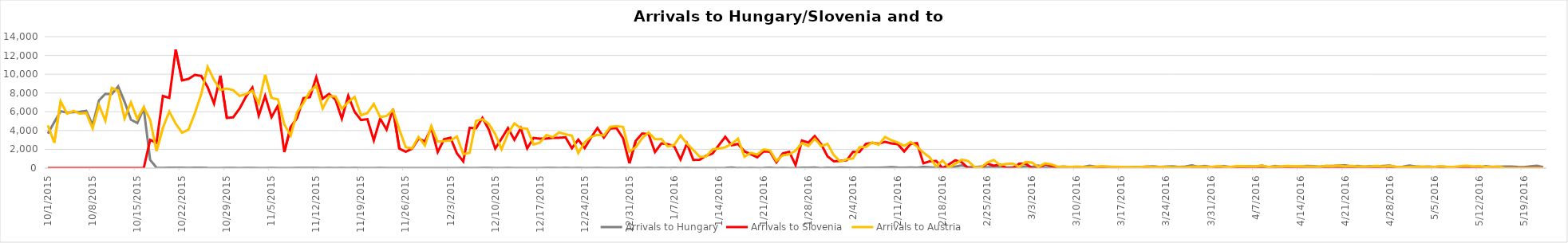
| Category | Arrivals to Hungary | Arrivals to Slovenia | Arrivals to Austria |
|---|---|---|---|
| 10/1/15 | 3667 | 0 | 4550 |
| 10/2/15 | 4897 | 0 | 2700 |
| 10/3/15 | 6056 | 0 | 7100 |
| 10/4/15 | 5925 | 0 | 5800 |
| 10/5/15 | 5952 | 0 | 6100 |
| 10/6/15 | 6000 | 0 | 5800 |
| 10/7/15 | 6103 | 0 | 5861 |
| 10/8/15 | 4583 | 6 | 4229 |
| 10/9/15 | 7215 | 0 | 6700 |
| 10/10/15 | 7907 | 0 | 5050 |
| 10/11/15 | 7897 | 0 | 8540 |
| 10/12/15 | 8702 | 0 | 8240 |
| 10/13/15 | 7081 | 0 | 5280 |
| 10/14/15 | 5157 | 0 | 7000 |
| 10/15/15 | 4808 | 0 | 5235 |
| 10/16/15 | 6353 | 0 | 6500 |
| 10/17/15 | 870 | 3000 | 5155 |
| 10/18/15 | 41 | 2700 | 1822 |
| 10/19/15 | 22 | 7677 | 4300 |
| 10/20/15 | 36 | 7478 | 6017 |
| 10/21/15 | 39 | 12616 | 4737 |
| 10/22/15 | 32 | 9339 | 3767 |
| 10/23/15 | 29 | 9500 | 4092 |
| 10/24/15 | 35 | 9925 | 5841 |
| 10/25/15 | 34 | 9818 | 7882 |
| 10/26/15 | 12 | 8625 | 10784 |
| 10/27/15 | 7 | 6877 | 9390 |
| 10/28/15 | 4 | 9848 | 8336 |
| 10/29/15 | 23 | 5341 | 8473 |
| 10/30/15 | 18 | 5409 | 8302 |
| 10/31/15 | 10 | 6344 | 7691 |
| 11/1/15 | 14 | 7611 | 7887 |
| 11/2/15 | 31 | 8568 | 8243 |
| 11/3/15 | 8 | 5591 | 6900 |
| 11/4/15 | 10 | 7693 | 9930 |
| 11/5/15 | 18 | 5426 | 7478 |
| 11/6/15 | 4 | 6655 | 7315 |
| 11/7/15 | 8 | 1716 | 4648 |
| 11/8/15 | 9 | 4381 | 3465 |
| 11/9/15 | 25 | 5341 | 5962 |
| 11/10/15 | 14 | 7457 | 6933 |
| 11/11/15 | 13 | 7554 | 8169 |
| 11/12/15 | 23 | 9681 | 8777 |
| 11/13/15 | 6 | 7397 | 6351 |
| 11/14/15 | 21 | 7905 | 7659 |
| 11/15/15 | 8 | 7300 | 7632 |
| 11/16/15 | 15 | 5261 | 6319 |
| 11/17/15 | 5 | 7704 | 7026 |
| 11/18/15 | 15 | 5998 | 7577 |
| 11/19/15 | 4 | 5119 | 5635 |
| 11/20/15 | 9 | 5211 | 5865 |
| 11/21/15 | 2 | 2952 | 6836 |
| 11/22/15 | 11 | 5260 | 5446 |
| 11/23/15 | 4 | 4102 | 5546 |
| 11/24/15 | 4 | 6297 | 6204 |
| 11/25/15 | 6 | 2070 | 4122 |
| 11/26/15 | 10 | 1742 | 2211 |
| 11/27/15 | 2 | 2065 | 2120 |
| 11/28/15 | 6 | 3139 | 3320 |
| 11/29/15 | 3 | 2843 | 2407 |
| 11/30/15 | 7 | 4274 | 4482 |
| 12/1/15 | 4 | 1709 | 2821 |
| 12/2/15 | 4 | 3077 | 2874 |
| 12/3/15 | 9 | 3237 | 2935 |
| 12/4/15 | 1 | 1577 | 3366 |
| 12/5/15 | 31 | 715 | 1493 |
| 12/6/15 | 7 | 4288 | 1643 |
| 12/7/15 | 0 | 4240 | 5035 |
| 12/8/15 | 13 | 5351 | 5210 |
| 12/9/15 | 14 | 4103 | 4714 |
| 12/10/15 | 3 | 2078 | 3623 |
| 12/11/15 | 0 | 3149 | 2000 |
| 12/12/15 | 13 | 4271 | 3675 |
| 12/13/15 | 10 | 3016 | 4754 |
| 12/14/15 | 3 | 4250 | 4263 |
| 12/15/15 | 2 | 2098 | 4193 |
| 12/16/15 | 6 | 3214 | 2519 |
| 12/17/15 | 0 | 3135 | 2717 |
| 12/18/15 | 11 | 3150 | 3532 |
| 12/19/15 | 31 | 3222 | 3305 |
| 12/20/15 | 8 | 3233 | 3800 |
| 12/21/15 | 25 | 3278 | 3611 |
| 12/22/15 | 1 | 2118 | 3451 |
| 12/23/15 | 21 | 3030 | 1613 |
| 12/24/15 | 8 | 2131 | 2764 |
| 12/25/15 | 2 | 3257 | 3321 |
| 12/26/15 | 17 | 4274 | 3532 |
| 12/27/15 | 10 | 3253 | 3476 |
| 12/28/15 | 0 | 4228 | 4394 |
| 12/29/15 | 0 | 4239 | 4468 |
| 12/30/15 | 11 | 3195 | 4386 |
| 12/31/15 | 5 | 511 | 1756 |
| 1/1/16 | 0 | 2914 | 2226 |
| 1/2/16 | 0 | 3690 | 3199 |
| 1/3/16 | 17 | 3619 | 3793 |
| 1/4/16 | 3 | 1708 | 3085 |
| 1/5/16 | 18 | 2626 | 3091 |
| 1/6/16 | 5 | 2550 | 2299 |
| 1/7/16 | 31 | 2337 | 2466 |
| 1/8/16 | 7 | 916 | 3472 |
| 1/9/16 | 15 | 2630 | 2619 |
| 1/10/16 | 6 | 880 | 1934 |
| 1/11/16 | 7 | 897 | 1204 |
| 1/12/16 | 2 | 1308 | 1231 |
| 1/13/16 | 5 | 1544 | 1991 |
| 1/14/16 | 4 | 2449 | 2082 |
| 1/15/16 | 14 | 3330 | 2219 |
| 1/16/16 | 65 | 2435 | 2578 |
| 1/17/16 | 11 | 2570 | 3141 |
| 1/18/16 | 9 | 1783 | 1203 |
| 1/19/16 | 29 | 1476 | 1630 |
| 1/20/16 | 10 | 1154 | 1439 |
| 1/21/16 | 13 | 1787 | 1989 |
| 1/22/16 | 47 | 1738 | 1885 |
| 1/23/16 | 10 | 606 | 777 |
| 1/24/16 | 15 | 1564 | 1366 |
| 1/25/16 | 5 | 1746 | 1450 |
| 1/26/16 | 4 | 326 | 1867 |
| 1/27/16 | 36 | 2935 | 2670 |
| 1/28/16 | 51 | 2719 | 2340 |
| 1/29/16 | 69 | 3416 | 3121 |
| 1/30/16 | 6 | 2556 | 2351 |
| 1/31/16 | 39 | 1249 | 2579 |
| 2/1/16 | 31 | 716 | 1367 |
| 2/2/16 | 69 | 765 | 690 |
| 2/3/16 | 46 | 841 | 937 |
| 2/4/16 | 31 | 1733 | 1026 |
| 2/5/16 | 19 | 1713 | 2235 |
| 2/6/16 | 49 | 2580 | 2252 |
| 2/7/16 | 53 | 2694 | 2737 |
| 2/8/16 | 48 | 2582 | 2490 |
| 2/9/16 | 72 | 2805 | 3314 |
| 2/10/16 | 104 | 2637 | 2968 |
| 2/11/16 | 54 | 2547 | 2731 |
| 2/12/16 | 39 | 1774 | 2378 |
| 2/13/16 | 66 | 2576 | 2781 |
| 2/14/16 | 51 | 2660 | 2301 |
| 2/15/16 | 119 | 516 | 1651 |
| 2/16/16 | 93 | 715 | 1143 |
| 2/17/16 | 34 | 769 | 181 |
| 2/18/16 | 73 | 0 | 817 |
| 2/19/16 | 113 | 407 | 50 |
| 2/20/16 | 151 | 828 | 453 |
| 2/21/16 | 288 | 623 | 899 |
| 2/22/16 | 103 | 0 | 744 |
| 2/23/16 | 112 | 0 | 111 |
| 2/24/16 | 166 | 0 | 75 |
| 2/25/16 | 76 | 478 | 583 |
| 2/26/16 | 140 | 254 | 874 |
| 2/27/16 | 111 | 382 | 321 |
| 2/28/16 | 62 | 0 | 447 |
| 2/29/16 | 78 | 0 | 487 |
| 3/1/16 | 83 | 466 | 118 |
| 3/2/16 | 181 | 479 | 644 |
| 3/3/16 | 133 | 0 | 588 |
| 3/4/16 | 268 | 0 | 114 |
| 3/5/16 | 89 | 409 | 500 |
| 3/6/16 | 72 | 253 | 402 |
| 3/7/16 | 100 | 0 | 153 |
| 3/8/16 | 167 | 0 | 171 |
| 3/9/16 | 73 | 0 | 134 |
| 3/10/16 | 70 | 0 | 172 |
| 3/11/16 | 133 | 0 | 132 |
| 3/12/16 | 245 | 0 | 116 |
| 3/13/16 | 148 | 0 | 171 |
| 3/14/16 | 123 | 0 | 211 |
| 3/15/16 | 153 | 0 | 147 |
| 3/16/16 | 104 | 0 | 150 |
| 3/17/16 | 102 | 0 | 129 |
| 3/18/16 | 95 | 0 | 107 |
| 3/19/16 | 132 | 0 | 109 |
| 3/20/16 | 107 | 0 | 126 |
| 3/21/16 | 176 | 0 | 177 |
| 3/22/16 | 188 | 0 | 103 |
| 3/23/16 | 137 | 0 | 127 |
| 3/24/16 | 171 | 0 | 121 |
| 3/25/16 | 199 | 0 | 94 |
| 3/26/16 | 125 | 0 | 104 |
| 3/27/16 | 171 | 6 | 78 |
| 3/28/16 | 293 | 0 | 144 |
| 3/29/16 | 154 | 5 | 170 |
| 3/30/16 | 234 | 4 | 152 |
| 3/31/16 | 127 | 0 | 120 |
| 4/1/16 | 142 | 0 | 210 |
| 4/2/16 | 217 | 0 | 156 |
| 4/3/16 | 119 | 0 | 122 |
| 4/4/16 | 99 | 0 | 221 |
| 4/5/16 | 176 | 2 | 203 |
| 4/6/16 | 191 | 0 | 198 |
| 4/7/16 | 178 | 0 | 196 |
| 4/8/16 | 280 | 0 | 254 |
| 4/9/16 | 83 | 0 | 138 |
| 4/10/16 | 230 | 0 | 171 |
| 4/11/16 | 149 | 0 | 171 |
| 4/12/16 | 214 | 0 | 232 |
| 4/13/16 | 150 | 0 | 193 |
| 4/14/16 | 161 | 0 | 209 |
| 4/15/16 | 237 | 0 | 176 |
| 4/16/16 | 210 | 0 | 175 |
| 4/17/16 | 144 | 0 | 148 |
| 4/18/16 | 229 | 0 | 231 |
| 4/19/16 | 235 | 0 | 183 |
| 4/20/16 | 274 | 0 | 268 |
| 4/21/16 | 294 | 0 | 195 |
| 4/22/16 | 195 | 0 | 227 |
| 4/23/16 | 226 | 0 | 174 |
| 4/24/16 | 151 | 0 | 175 |
| 4/25/16 | 202 | 0 | 191 |
| 4/26/16 | 190 | 0 | 230 |
| 4/27/16 | 241 | 0 | 172 |
| 4/28/16 | 284 | 0 | 232 |
| 4/29/16 | 108 | 0 | 151 |
| 4/30/16 | 141 | 0 | 102 |
| 5/1/16 | 274 | 0 | 136 |
| 5/2/16 | 187 | 0 | 150 |
| 5/3/16 | 131 | 0 | 173 |
| 5/4/16 | 169 | 0 | 141 |
| 5/5/16 | 133 | 0 | 128 |
| 5/6/16 | 178 | 0 | 201 |
| 5/7/16 | 132 | 0 | 129 |
| 5/8/16 | 75 | 0 | 121 |
| 5/9/16 | 124 | 0 | 218 |
| 5/10/16 | 128 | 0 | 260 |
| 5/11/16 | 120 | 0 | 191 |
| 5/12/16 | 89 | 0 | 210 |
| 5/13/16 | 201 | 0 | 120 |
| 5/14/16 | 120 | 0 | 150 |
| 5/15/16 | 139 | 0 | 169 |
| 5/16/16 | 169 | 0 | 0 |
| 5/17/16 | 164 | 0 | 0 |
| 5/18/16 | 121 | 0 | 0 |
| 5/19/16 | 100 | 0 | 0 |
| 5/20/16 | 198 | 0 | 0 |
| 5/21/16 | 245 | 0 | 0 |
| 5/22/16 | 108 | 0 | 0 |